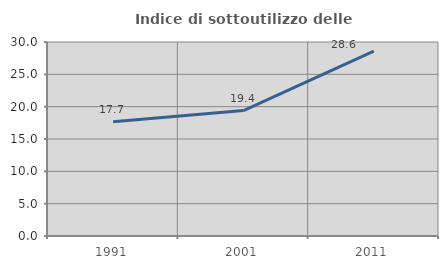
| Category | Indice di sottoutilizzo delle abitazioni  |
|---|---|
| 1991.0 | 17.658 |
| 2001.0 | 19.4 |
| 2011.0 | 28.571 |